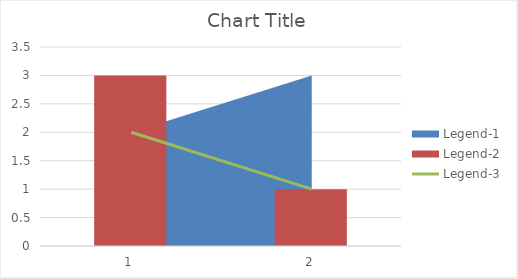
| Category | Legend-2 |
|---|---|
| 0 | 3 |
| 1 | 1 |